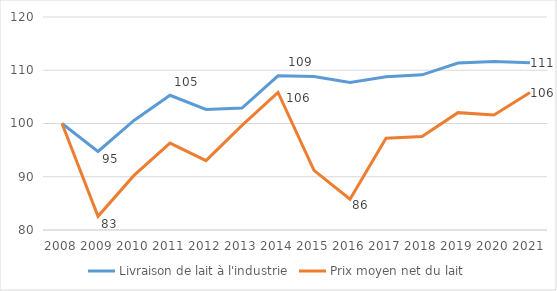
| Category | Livraison de lait à l'industrie | Prix moyen net du lait |
|---|---|---|
| 2008.0 | 100 | 100 |
| 2009.0 | 94.753 | 82.568 |
| 2010.0 | 100.579 | 90.251 |
| 2011.0 | 105.299 | 96.332 |
| 2012.0 | 102.644 | 93.028 |
| 2013.0 | 102.901 | 99.651 |
| 2014.0 | 108.961 | 105.845 |
| 2015.0 | 108.828 | 91.208 |
| 2016.0 | 107.705 | 85.778 |
| 2017.0 | 108.772 | 97.217 |
| 2018.0 | 109.144 | 97.548 |
| 2019.0 | 111.349 | 102.041 |
| 2020.0 | 111.648 | 101.6 |
| 2021.0 | 111.427 | 105.817 |